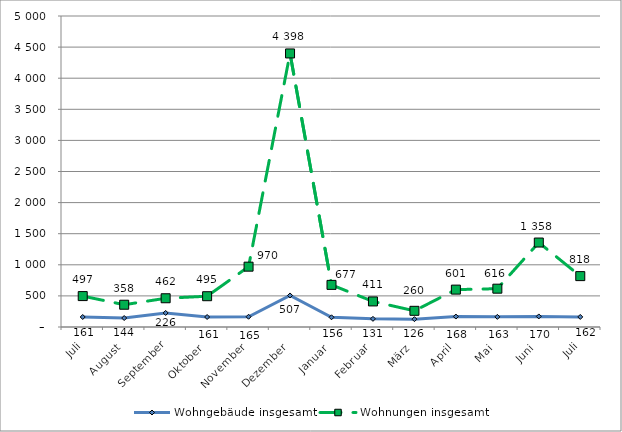
| Category | Wohngebäude insgesamt | Wohnungen insgesamt |
|---|---|---|
| Juli | 161 | 497 |
| August | 144 | 358 |
| September | 226 | 462 |
| Oktober | 161 | 495 |
| November | 165 | 970 |
| Dezember | 507 | 4398 |
| Januar | 156 | 677 |
| Februar | 131 | 411 |
| März | 126 | 260 |
| April | 168 | 601 |
| Mai | 163 | 616 |
| Juni | 170 | 1358 |
| Juli | 162 | 818 |